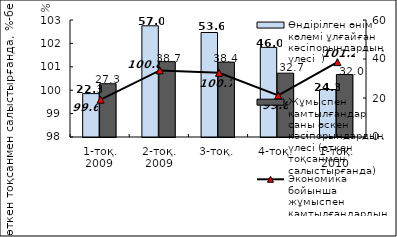
| Category | Өндірілген өнім көлемі ұлғайған кәсіпорындардың үлесі  ) | Жұмыспен қамтылғандар саны өскен кәсіпорындардың үлесі (өткен тоқсанмен салыстырғанда) |
|---|---|---|
| 1-тоқ. 2009  | 22.251 | 27.321 |
| 2-тоқ. 2009 | 57.025 | 38.652 |
| 3-тоқ. | 53.592 | 38.398 |
| 4-тоқ. | 45.963 | 32.74 |
| 1-тоқ. 2010  | 24.348 | 32.041 |